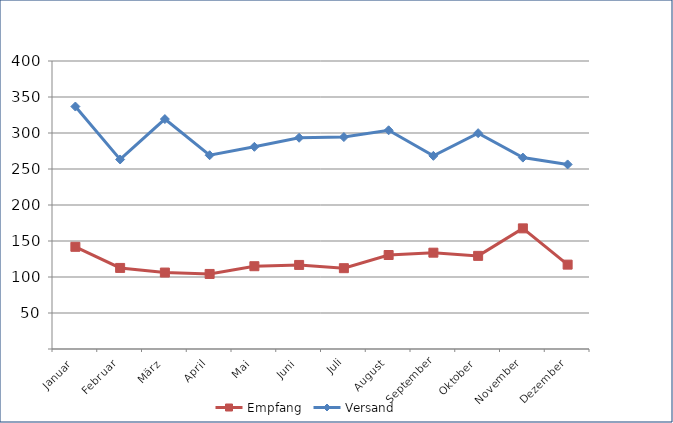
| Category | Empfang | Versand |
|---|---|---|
| Januar | 141.927 | 336.751 |
| Februar | 112.587 | 263.233 |
| März | 106.174 | 319.341 |
| April | 104.253 | 269.121 |
| Mai | 114.981 | 280.812 |
| Juni | 116.761 | 293.391 |
| Juli | 112.241 | 294.353 |
| August | 130.537 | 303.755 |
| September | 133.785 | 268.265 |
| Oktober | 129.341 | 299.771 |
| November | 167.55 | 265.839 |
| Dezember | 117.169 | 256.348 |